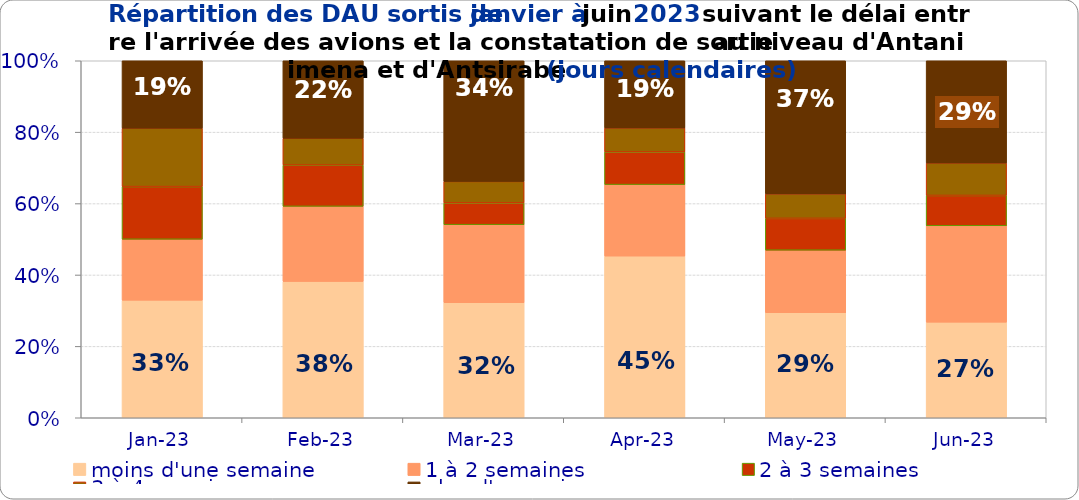
| Category | moins d'une semaine | 1 à 2 semaines | 2 à 3 semaines | 3 à 4 semaines | plus d'un mois |
|---|---|---|---|---|---|
| 2023-01-01 | 0.329 | 0.171 | 0.148 | 0.164 | 0.189 |
| 2023-02-01 | 0.382 | 0.21 | 0.116 | 0.075 | 0.217 |
| 2023-03-01 | 0.322 | 0.218 | 0.061 | 0.06 | 0.338 |
| 2023-04-01 | 0.453 | 0.2 | 0.092 | 0.067 | 0.188 |
| 2023-05-01 | 0.294 | 0.175 | 0.089 | 0.069 | 0.373 |
| 2023-06-01 | 0.268 | 0.27 | 0.085 | 0.091 | 0.286 |